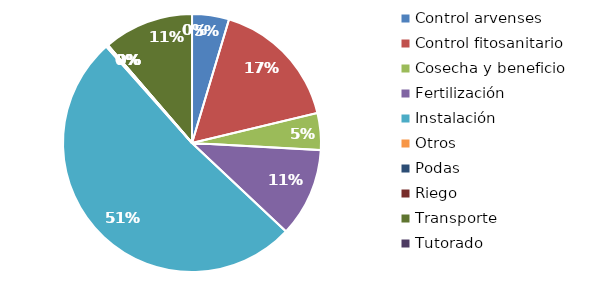
| Category | Valor |
|---|---|
| Control arvenses | 270000 |
| Control fitosanitario | 970000 |
| Cosecha y beneficio | 270000 |
| Fertilización | 650000 |
| Instalación | 3000000 |
| Otros | 15000 |
| Podas | 0 |
| Riego | 0 |
| Transporte | 660000 |
| Tutorado | 0 |